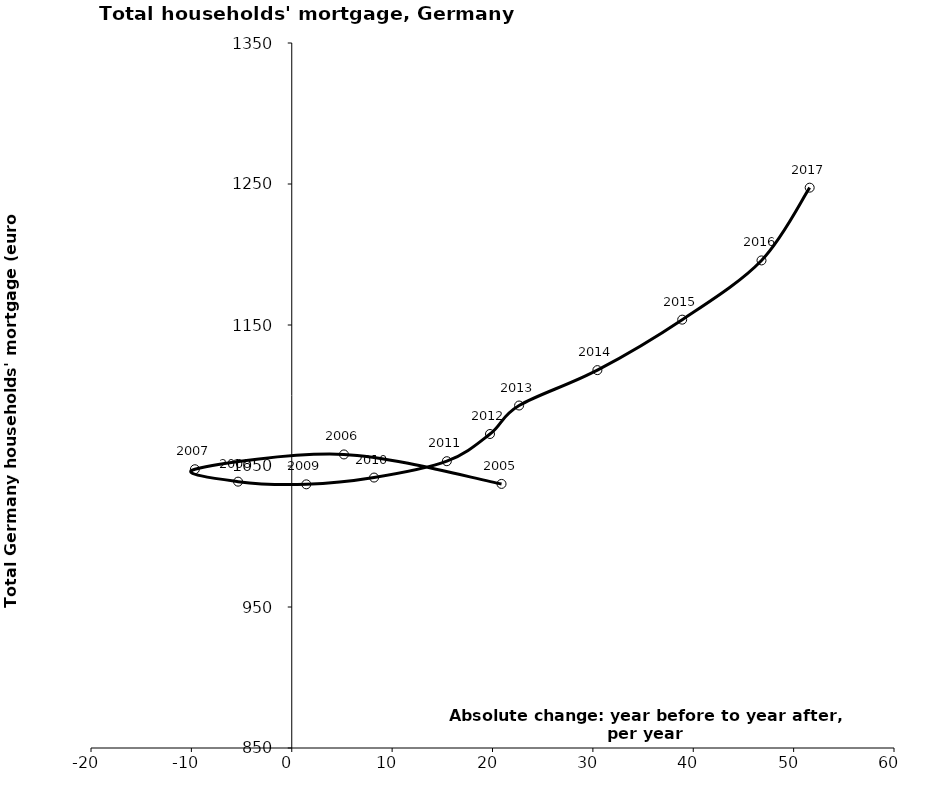
| Category | Series 0 |
|---|---|
| 20.90000000000009 | 1037.3 |
| 5.2000000000000455 | 1058.2 |
| -9.649999999999977 | 1047.7 |
| -5.350000000000023 | 1038.9 |
| 1.4499999999999318 | 1037 |
| 8.200000000000045 | 1041.8 |
| 15.450000000000045 | 1053.4 |
| 19.75 | 1072.7 |
| 22.649999999999977 | 1092.9 |
| 30.449999999999932 | 1118 |
| 38.89999999999998 | 1153.8 |
| 46.80000000000007 | 1195.8 |
| 51.600000000000136 | 1247.4 |